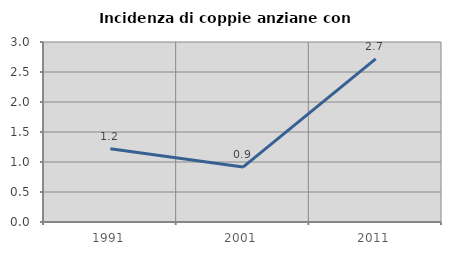
| Category | Incidenza di coppie anziane con figli |
|---|---|
| 1991.0 | 1.221 |
| 2001.0 | 0.915 |
| 2011.0 | 2.72 |